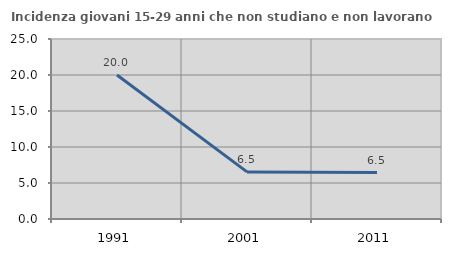
| Category | Incidenza giovani 15-29 anni che non studiano e non lavorano  |
|---|---|
| 1991.0 | 20 |
| 2001.0 | 6.542 |
| 2011.0 | 6.452 |